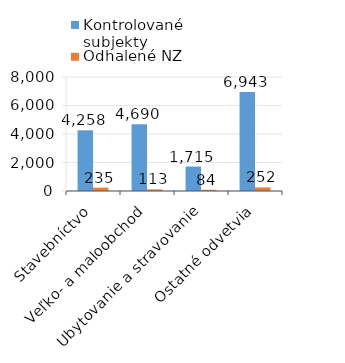
| Category | Kontrolované subjekty | Odhalené NZ |
|---|---|---|
| Stavebníctvo | 4258 | 235 |
| Veľko- a maloobchod | 4690 | 113 |
| Ubytovanie a stravovanie | 1715 | 84 |
| Ostatné odvetvia | 6943 | 252 |